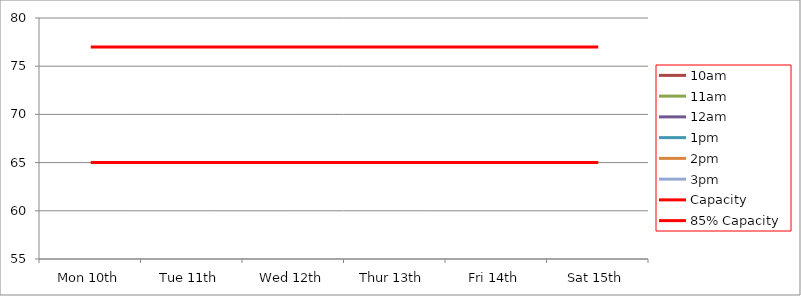
| Category | 9am | 10am | 11am | 12am | 1pm | 2pm | 3pm | 4pm | 5pm | Capacity | 85% Capacity |
|---|---|---|---|---|---|---|---|---|---|---|---|
| Mon 10th |  |  |  |  |  |  |  |  |  | 77 | 65 |
| Tue 11th |  |  |  |  |  |  |  |  |  | 77 | 65 |
| Wed 12th |  |  |  |  |  |  |  |  |  | 77 | 65 |
| Thur 13th |  |  |  |  |  |  |  |  |  | 77 | 65 |
| Fri 14th |  |  |  |  |  |  |  |  |  | 77 | 65 |
| Sat 15th |  |  |  |  |  |  |  |  |  | 77 | 65 |